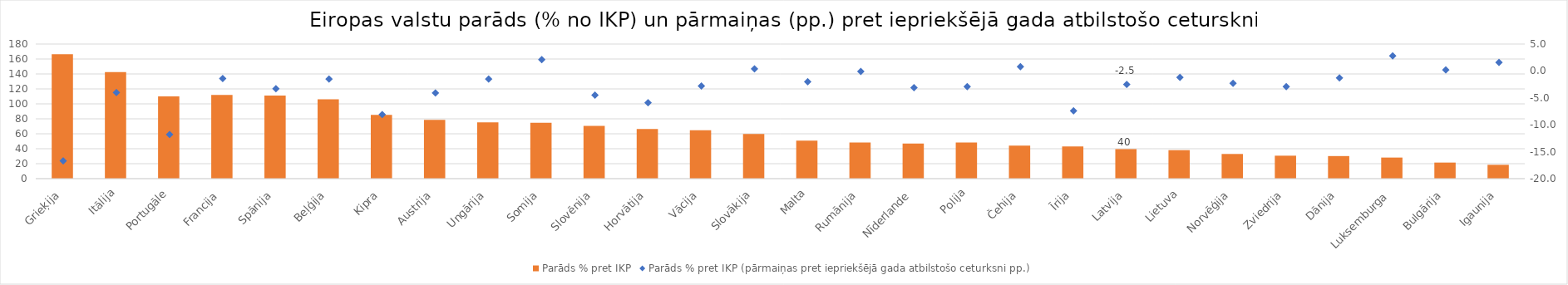
| Category | Parāds % pret IKP |
|---|---|
| Grieķija | 166.5 |
| Itālija | 142.4 |
| Portugāle | 110.1 |
| Francija | 111.9 |
| Spānija | 111.2 |
|  Beļģija | 106 |
| Kipra | 85.3 |
| Austrija | 78.6 |
| Ungārija | 75.2 |
| Somija | 74.6 |
| Slovēnija | 70.5 |
| Horvātija | 66.5 |
| Vācija | 64.6 |
| Slovākija | 59.6 |
| Malta | 50.7 |
| Rumānija | 48.2 |
| Nīderlande | 46.9 |
| Polija | 48.4 |
| Čehija | 44.3 |
| Īrija | 43.1 |
| Latvija | 39.5 |
| Lietuva | 38.1 |
| Norvēģija | 33 |
| Zviedrija | 30.7 |
| Dānija | 30.2 |
| Luksemburga | 28.2 |
| Bulgārija | 21.5 |
| Igaunija | 18.5 |